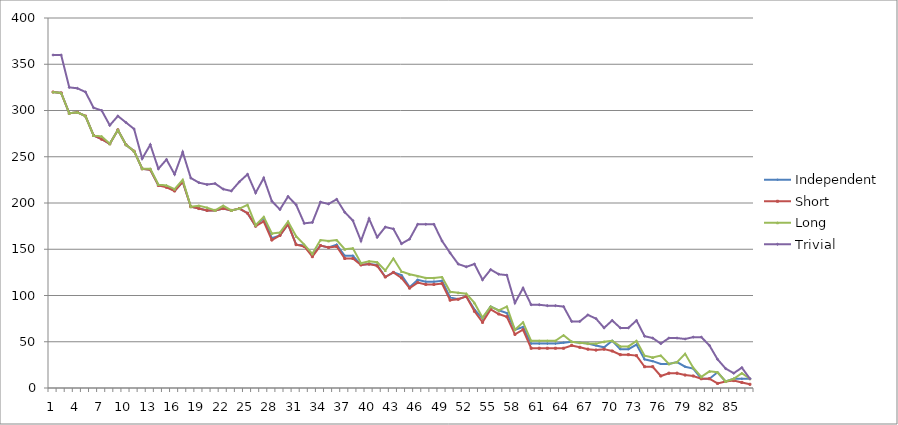
| Category | Independent | Short | Long | Trivial |
|---|---|---|---|---|
| 0 | 320 | 320 | 320 | 360 |
| 1 | 319 | 319 | 319 | 360 |
| 2 | 297 | 297 | 297 | 325 |
| 3 | 298 | 298 | 298 | 324 |
| 4 | 294 | 294 | 294 | 320 |
| 5 | 273 | 273 | 273 | 303 |
| 6 | 269 | 269 | 272 | 300 |
| 7 | 264 | 264 | 264 | 284 |
| 8 | 279 | 279 | 279 | 294 |
| 9 | 263 | 263 | 263 | 287 |
| 10 | 256 | 256 | 256 | 280 |
| 11 | 237 | 237 | 237 | 248 |
| 12 | 236 | 236 | 237 | 263 |
| 13 | 219 | 219 | 220 | 237 |
| 14 | 218 | 217 | 219 | 247 |
| 15 | 213 | 213 | 215 | 231 |
| 16 | 223 | 223 | 225 | 255 |
| 17 | 196 | 196 | 196 | 227 |
| 18 | 194 | 194 | 197 | 222 |
| 19 | 192 | 192 | 195 | 220 |
| 20 | 192 | 192 | 192 | 221 |
| 21 | 194 | 194 | 197 | 215 |
| 22 | 192 | 192 | 192 | 213 |
| 23 | 194 | 194 | 194 | 223 |
| 24 | 189 | 189 | 198 | 231 |
| 25 | 175 | 175 | 176 | 211 |
| 26 | 184 | 180 | 185 | 227 |
| 27 | 162 | 160 | 167 | 202 |
| 28 | 165 | 165 | 168 | 193 |
| 29 | 177 | 177 | 180 | 207 |
| 30 | 155 | 155 | 164 | 198 |
| 31 | 154 | 153 | 155 | 178 |
| 32 | 144 | 142 | 145 | 179 |
| 33 | 154 | 154 | 160 | 201 |
| 34 | 152 | 152 | 159 | 199 |
| 35 | 155 | 153 | 160 | 204 |
| 36 | 143 | 140 | 150 | 190 |
| 37 | 143 | 140 | 151 | 181 |
| 38 | 133 | 133 | 135 | 159 |
| 39 | 134 | 134 | 137 | 183 |
| 40 | 133 | 132 | 136 | 163 |
| 41 | 120 | 120 | 127 | 174 |
| 42 | 125 | 125 | 140 | 172 |
| 43 | 122 | 119 | 126 | 156 |
| 44 | 109 | 108 | 123 | 161 |
| 45 | 117 | 114 | 121 | 177 |
| 46 | 115 | 112 | 119 | 177 |
| 47 | 115 | 112 | 119 | 177 |
| 48 | 116 | 113 | 120 | 159 |
| 49 | 98 | 95 | 104 | 146 |
| 50 | 96 | 96 | 103 | 134 |
| 51 | 99 | 99 | 102 | 131 |
| 52 | 85 | 83 | 92 | 134 |
| 53 | 75 | 71 | 76 | 117 |
| 54 | 88 | 85 | 88 | 128 |
| 55 | 84 | 80 | 84 | 123 |
| 56 | 81 | 77 | 88 | 122 |
| 57 | 63 | 58 | 63 | 92 |
| 58 | 66 | 63 | 71 | 108 |
| 59 | 48 | 43 | 51 | 90 |
| 60 | 48 | 43 | 51 | 90 |
| 61 | 48 | 43 | 51 | 89 |
| 62 | 48 | 43 | 51 | 89 |
| 63 | 49 | 43 | 57 | 88 |
| 64 | 50 | 46 | 50 | 72 |
| 65 | 49 | 44 | 49 | 72 |
| 66 | 48 | 42 | 48 | 79 |
| 67 | 46 | 41 | 48 | 75 |
| 68 | 44 | 42 | 50 | 65 |
| 69 | 51 | 40 | 51 | 73 |
| 70 | 42 | 36 | 45 | 65 |
| 71 | 42 | 36 | 45 | 65 |
| 72 | 47 | 35 | 51 | 73 |
| 73 | 31 | 23 | 35 | 56 |
| 74 | 29 | 23 | 33 | 54 |
| 75 | 26 | 13 | 35 | 48 |
| 76 | 26 | 16 | 26 | 54 |
| 77 | 28 | 16 | 28 | 54 |
| 78 | 23 | 14 | 37 | 53 |
| 79 | 21 | 13 | 22 | 55 |
| 80 | 10 | 10 | 12 | 55 |
| 81 | 10 | 10 | 18 | 46 |
| 82 | 17 | 5 | 17 | 31 |
| 83 | 7 | 7 | 7 | 21 |
| 84 | 10 | 8 | 10 | 16 |
| 85 | 10 | 6 | 16 | 22 |
| 86 | 10 | 4 | 10 | 10 |